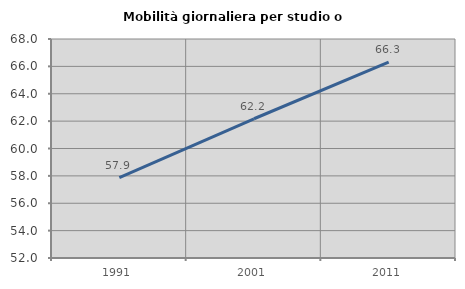
| Category | Mobilità giornaliera per studio o lavoro |
|---|---|
| 1991.0 | 57.866 |
| 2001.0 | 62.173 |
| 2011.0 | 66.304 |